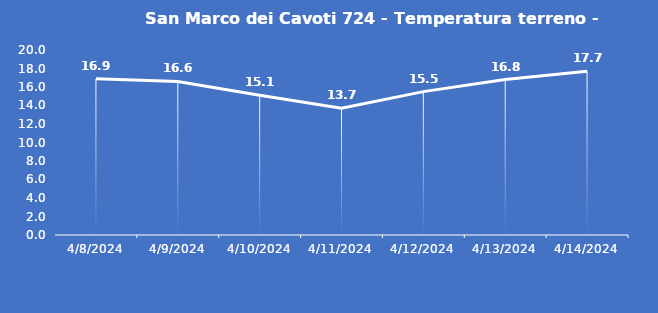
| Category | San Marco dei Cavoti 724 - Temperatura terreno - Grezzo (°C) |
|---|---|
| 4/8/24 | 16.9 |
| 4/9/24 | 16.6 |
| 4/10/24 | 15.1 |
| 4/11/24 | 13.7 |
| 4/12/24 | 15.5 |
| 4/13/24 | 16.8 |
| 4/14/24 | 17.7 |